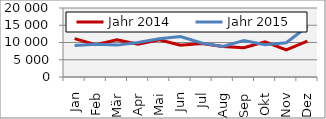
| Category | Jahr 2014 | Jahr 2015 |
|---|---|---|
| Jan | 11127.998 | 9117.551 |
| Feb | 9378.958 | 9478.115 |
| Mär | 10781.935 | 9240.446 |
| Apr | 9498.431 | 10004.633 |
| Mai | 10770.913 | 11112.899 |
| Jun | 9189.473 | 11735.386 |
| Jul | 9732.651 | 9843.127 |
| Aug | 8853.561 | 8870.487 |
| Sep | 8490.935 | 10556.357 |
| Okt | 10183.34 | 9378.826 |
| Nov | 7862.955 | 9922.05 |
| Dez | 10388.496 | 14640.557 |